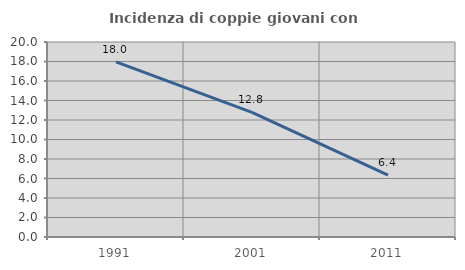
| Category | Incidenza di coppie giovani con figli |
|---|---|
| 1991.0 | 17.971 |
| 2001.0 | 12.787 |
| 2011.0 | 6.352 |